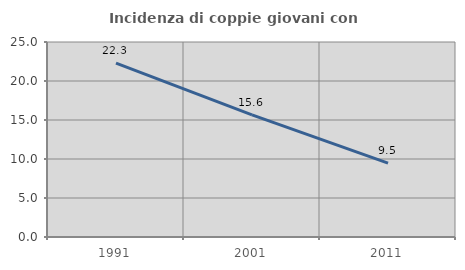
| Category | Incidenza di coppie giovani con figli |
|---|---|
| 1991.0 | 22.291 |
| 2001.0 | 15.649 |
| 2011.0 | 9.472 |